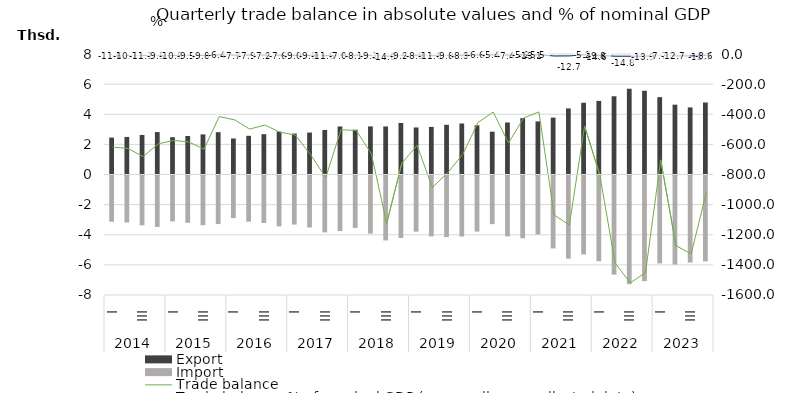
| Category | Export | Import |
|---|---|---|
| 0 | 2450.7 | -3068.8 |
| 1 | 2493.4 | -3120.5 |
| 2 | 2625.5 | -3306.5 |
| 3 | 2816.7 | -3413.2 |
| 4 | 2476.5 | -3050.1 |
| 5 | 2555.2 | -3139.2 |
| 6 | 2663.4 | -3295.5 |
| 7 | 2809.5 | -3225.4 |
| 8 | 2391.5 | -2828.1 |
| 9 | 2569.5 | -3068 |
| 10 | 2678.2 | -3149.9 |
| 11 | 2850.8 | -3370.5 |
| 12 | 2719.6 | -3257.4 |
| 13 | 2783.8 | -3452 |
| 14 | 2956.9 | -3777.4 |
| 15 | 3187 | -3690 |
| 16 | 2969.9 | -3477.4 |
| 17 | 3193.3 | -3857.4 |
| 18 | 3189.7 | -4313.9 |
| 19 | 3420.5 | -4144.2 |
| 20 | 3123.6 | -3730.2 |
| 21 | 3158.2 | -4044.8 |
| 22 | 3298.5 | -4087.5 |
| 23 | 3385.3 | -4051.1 |
| 24 | 3266.4 | -3720.9 |
| 25 | 2842.7 | -3228.3 |
| 26 | 3452.8 | -4043.7 |
| 27 | 3742.7 | -4166.6 |
| 28 | 3526.2 | -3910.7 |
| 29 | 3776 | -4844.9 |
| 30 | 4388.7 | -5523.8 |
| 31 | 4761.5 | -5239.5 |
| 32 | 4886.7 | -5690.3 |
| 33 | 5194.3 | -6581.5 |
| 34 | 5692.8 | -7212.3 |
| 35 | 5559.7 | -7011.5 |
| 36 | 5134 | -5836.8 |
| 37 | 4635.9 | -5908.1 |
| 38 | 4454.2 | -5781.1 |
| 39 | 4780.2 | -5698.5 |